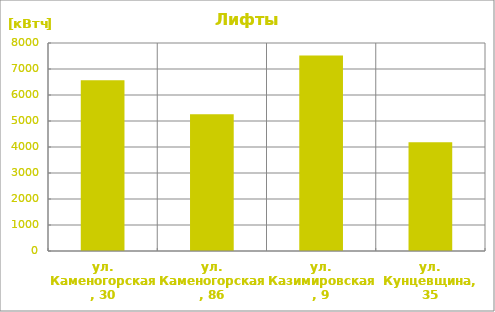
| Category | Series 0 |
|---|---|
| ул. Каменогорская, 30 | 6570 |
| ул. Каменогорская, 86 | 5256 |
| ул. Казимировская, 9 | 7519 |
| ул. Кунцевщина, 35 | 4182.9 |